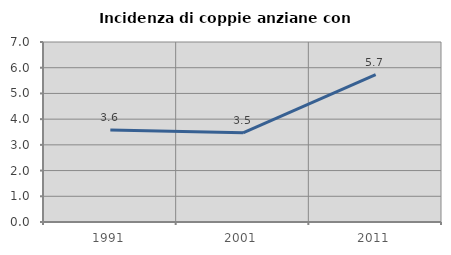
| Category | Incidenza di coppie anziane con figli |
|---|---|
| 1991.0 | 3.582 |
| 2001.0 | 3.47 |
| 2011.0 | 5.735 |